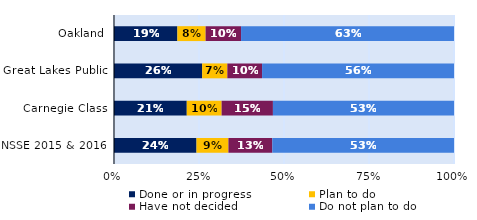
| Category | Done or in progress | Plan to do | Have not decided | Do not plan to do |
|---|---|---|---|---|
| Oakland | 0.186 | 0.083 | 0.104 | 0.626 |
| Great Lakes Public | 0.259 | 0.074 | 0.102 | 0.564 |
| Carnegie Class | 0.214 | 0.103 | 0.151 | 0.533 |
| NSSE 2015 & 2016 | 0.243 | 0.094 | 0.129 | 0.534 |